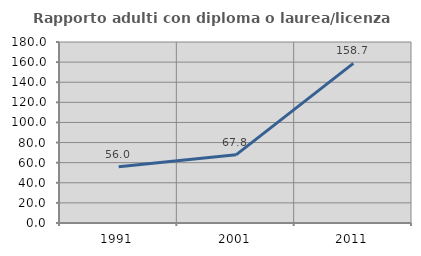
| Category | Rapporto adulti con diploma o laurea/licenza media  |
|---|---|
| 1991.0 | 56.022 |
| 2001.0 | 67.779 |
| 2011.0 | 158.699 |